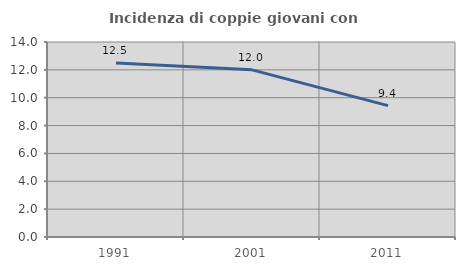
| Category | Incidenza di coppie giovani con figli |
|---|---|
| 1991.0 | 12.5 |
| 2001.0 | 12 |
| 2011.0 | 9.434 |